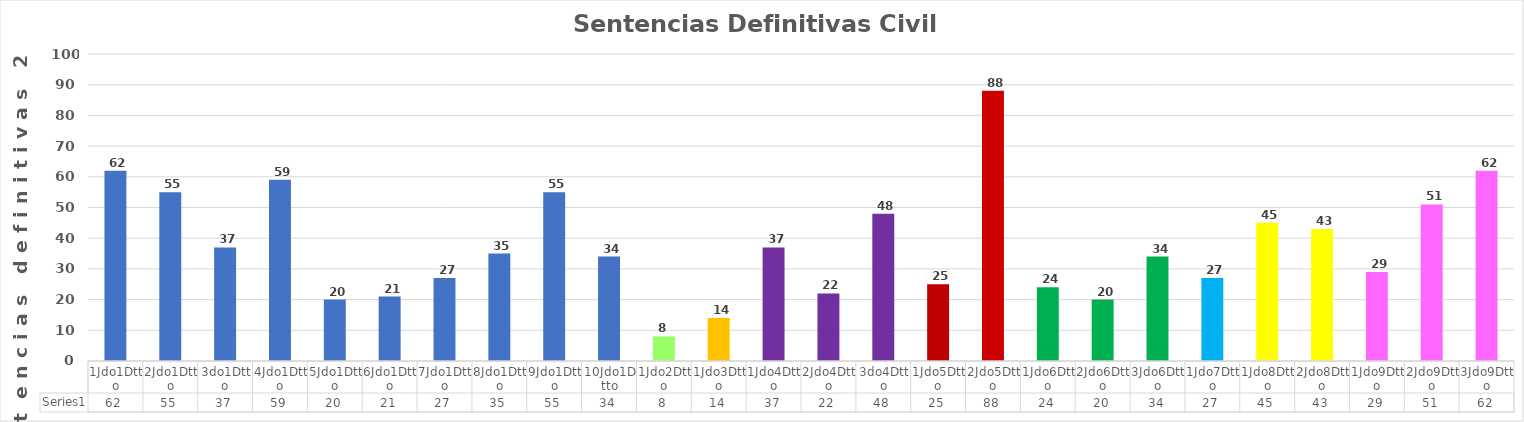
| Category | Series 0 |
|---|---|
| 1Jdo1Dtto | 62 |
| 2Jdo1Dtto | 55 |
| 3do1Dtto | 37 |
| 4Jdo1Dtto | 59 |
| 5Jdo1Dtto | 20 |
| 6Jdo1Dtto | 21 |
| 7Jdo1Dtto | 27 |
| 8Jdo1Dtto | 35 |
| 9Jdo1Dtto | 55 |
| 10Jdo1Dtto | 34 |
| 1Jdo2Dtto | 8 |
| 1Jdo3Dtto | 14 |
| 1Jdo4Dtto | 37 |
| 2Jdo4Dtto | 22 |
| 3do4Dtto | 48 |
| 1Jdo5Dtto | 25 |
| 2Jdo5Dtto | 88 |
| 1Jdo6Dtto | 24 |
| 2Jdo6Dtto | 20 |
| 3Jdo6Dtto | 34 |
| 1Jdo7Dtto | 27 |
| 1Jdo8Dtto | 45 |
| 2Jdo8Dtto | 43 |
| 1Jdo9Dtto | 29 |
| 2Jdo9Dtto | 51 |
| 3Jdo9Dtto | 62 |